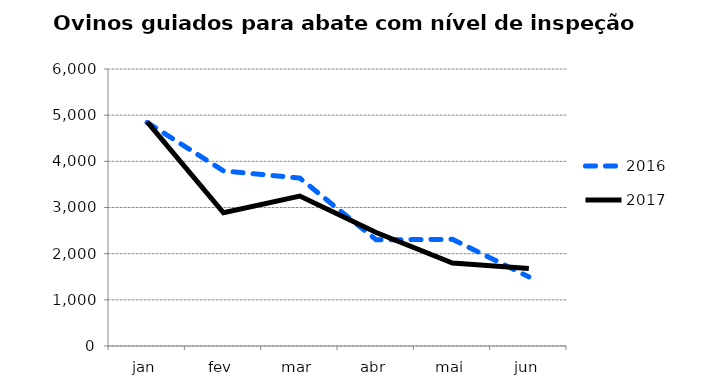
| Category | 2016 | 2017 |
|---|---|---|
| jan | 4841 | 4855 |
| fev | 3793 | 2885 |
| mar | 3637 | 3248 |
| abr | 2300 | 2459 |
| mai | 2311 | 1798 |
| jun | 1497 | 1677 |